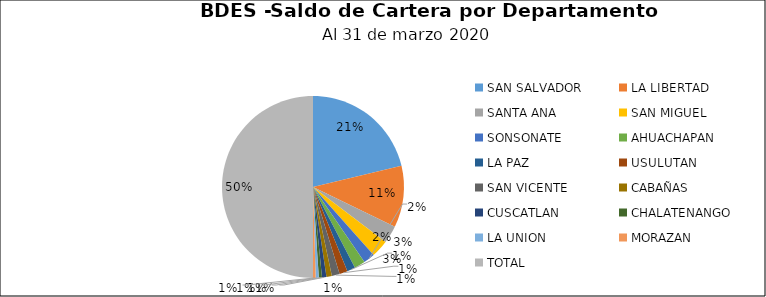
| Category | Saldo | Créditos |
|---|---|---|
| SAN SALVADOR | 163.269 | 6821 |
| LA LIBERTAD | 84.002 | 2109 |
| SANTA ANA | 24.025 | 1749 |
| SAN MIGUEL | 23.598 | 1978 |
| SONSONATE | 15.694 | 1181 |
| AHUACHAPAN | 14.799 | 905 |
| LA PAZ | 11.21 | 1256 |
| USULUTAN | 11.082 | 1252 |
| SAN VICENTE | 10.73 | 718 |
| CABAÑAS | 7.356 | 135 |
| CUSCATLAN | 6.052 | 452 |
| CHALATENANGO | 4.331 | 224 |
| LA UNION | 4.189 | 543 |
| MORAZAN | 3.6 | 519 |
| TOTAL | 383.936 | 19842 |